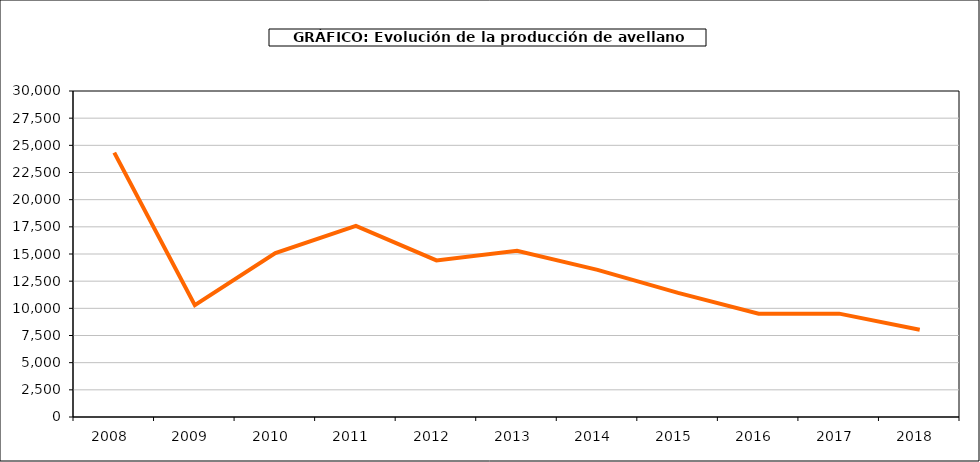
| Category | producción avellano |
|---|---|
| 2008.0 | 24330 |
| 2009.0 | 10290 |
| 2010.0 | 15086 |
| 2011.0 | 17590 |
| 2012.0 | 14406 |
| 2013.0 | 15302 |
| 2014.0 | 13544 |
| 2015.0 | 11423 |
| 2016.0 | 9510 |
| 2017.0 | 9510 |
| 2018.0 | 8033 |